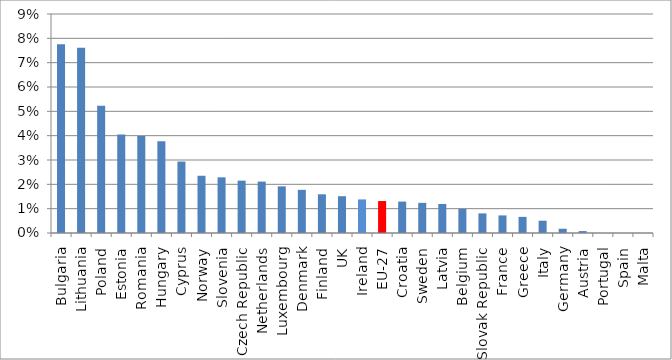
| Category | Series 0 |
|---|---|
| Bulgaria | 0.078 |
| Lithuania | 0.076 |
| Poland | 0.052 |
| Estonia | 0.04 |
| Romania | 0.04 |
| Hungary | 0.038 |
| Cyprus | 0.029 |
| Norway | 0.024 |
| Slovenia | 0.023 |
| Czech Republic | 0.022 |
| Netherlands | 0.021 |
| Luxembourg | 0.019 |
| Denmark | 0.018 |
| Finland | 0.016 |
| UK | 0.015 |
| Ireland | 0.014 |
| EU-27 | 0.013 |
| Croatia | 0.013 |
| Sweden | 0.012 |
| Latvia | 0.012 |
| Belgium | 0.01 |
| Slovak Republic | 0.008 |
| France | 0.007 |
| Greece | 0.007 |
| Italy | 0.005 |
| Germany | 0.002 |
| Austria | 0.001 |
| Portugal | 0 |
| Spain | 0 |
| Malta | 0 |